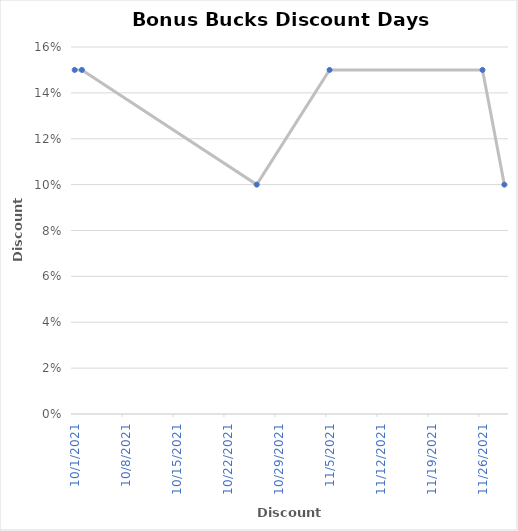
| Category | Discount |
|---|---|
| 11/29/21 | 0.1 |
| 11/26/21 | 0.15 |
| 11/5/21 | 0.15 |
| 10/26/21 | 0.1 |
| 10/2/21 | 0.15 |
| 10/1/21 | 0.15 |